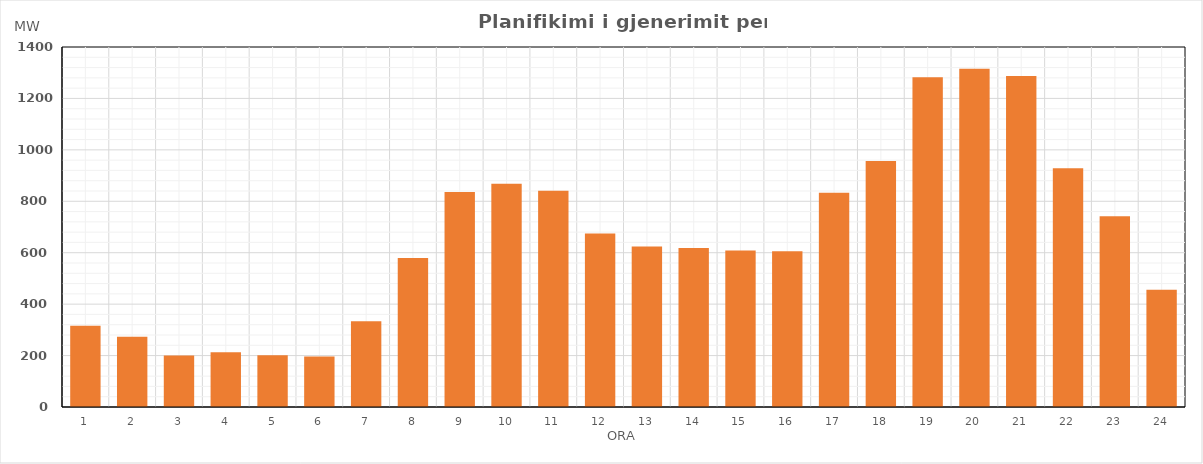
| Category | Max (MW) |
|---|---|
| 0 | 316.02 |
| 1 | 273.02 |
| 2 | 200.02 |
| 3 | 213.02 |
| 4 | 201.02 |
| 5 | 196.02 |
| 6 | 333.02 |
| 7 | 579.02 |
| 8 | 836.02 |
| 9 | 868.02 |
| 10 | 841.059 |
| 11 | 675.071 |
| 12 | 623.762 |
| 13 | 618.594 |
| 14 | 608.464 |
| 15 | 605.486 |
| 16 | 833.02 |
| 17 | 956.848 |
| 18 | 1282.798 |
| 19 | 1314.984 |
| 20 | 1286.824 |
| 21 | 928.226 |
| 22 | 742.24 |
| 23 | 456.438 |